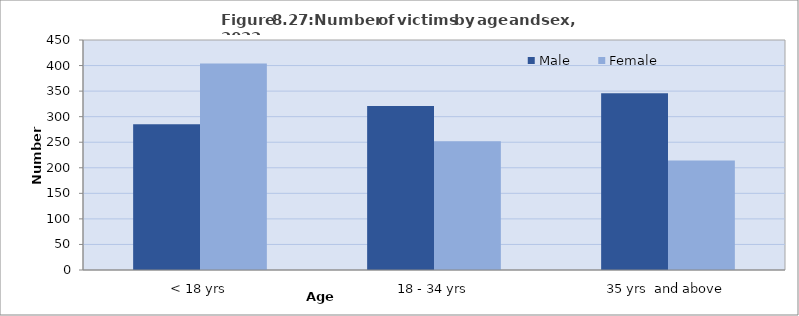
| Category | Male | Female |
|---|---|---|
| < 18 yrs | 285 | 404 |
| 18 - 34 yrs | 321 | 252 |
| 35 yrs  and above | 346 | 214 |